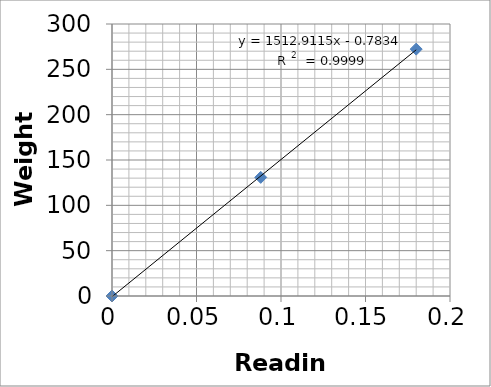
| Category | Series 0 |
|---|---|
| 0.0 | 0 |
| 0.088 | 130.82 |
| 0.18 | 272.29 |